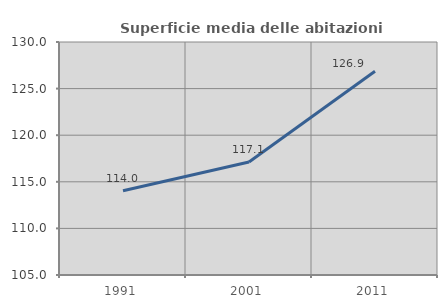
| Category | Superficie media delle abitazioni occupate |
|---|---|
| 1991.0 | 114.039 |
| 2001.0 | 117.127 |
| 2011.0 | 126.864 |